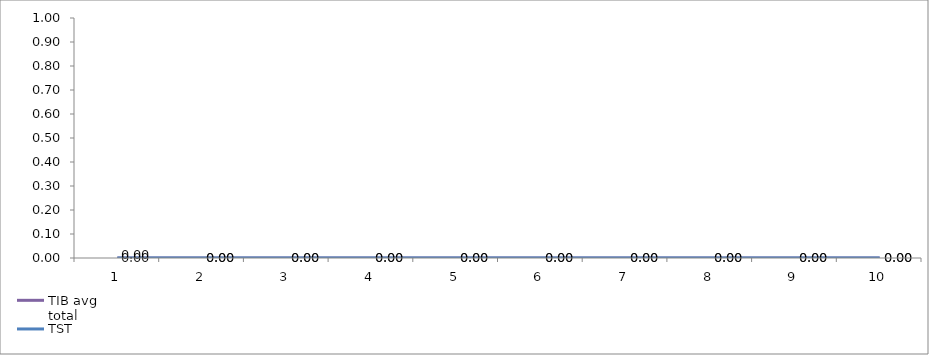
| Category | TIB avg total | TST |
|---|---|---|
| 0 | 0 | 0 |
| 1 | 0 | 0 |
| 2 | 0 | 0 |
| 3 | 0 | 0 |
| 4 | 0 | 0 |
| 5 | 0 | 0 |
| 6 | 0 | 0 |
| 7 | 0 | 0 |
| 8 | 0 | 0 |
| 9 | 0 | 0 |